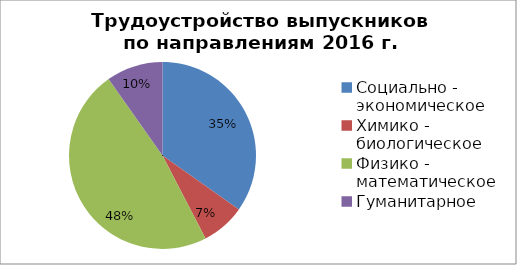
| Category | Series 0 |
|---|---|
| Социально - экономическое | 32 |
| Химико - биологическое | 7 |
| Физико - математическое | 44 |
| Гуманитарное | 9 |